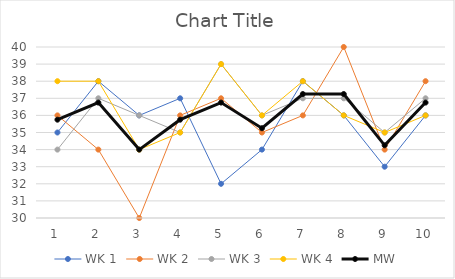
| Category | WK 1 | WK 2 | WK 3 | WK 4 | MW |
|---|---|---|---|---|---|
| 0 | 35 | 36 | 34 | 38 | 35.75 |
| 1 | 38 | 34 | 37 | 38 | 36.75 |
| 2 | 36 | 30 | 36 | 34 | 34 |
| 3 | 37 | 36 | 35 | 35 | 35.75 |
| 4 | 32 | 37 | 39 | 39 | 36.75 |
| 5 | 34 | 35 | 36 | 36 | 35.25 |
| 6 | 38 | 36 | 37 | 38 | 37.25 |
| 7 | 36 | 40 | 37 | 36 | 37.25 |
| 8 | 33 | 34 | 35 | 35 | 34.25 |
| 9 | 36 | 38 | 37 | 36 | 36.75 |